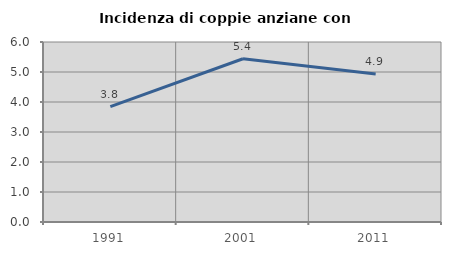
| Category | Incidenza di coppie anziane con figli |
|---|---|
| 1991.0 | 3.846 |
| 2001.0 | 5.441 |
| 2011.0 | 4.933 |